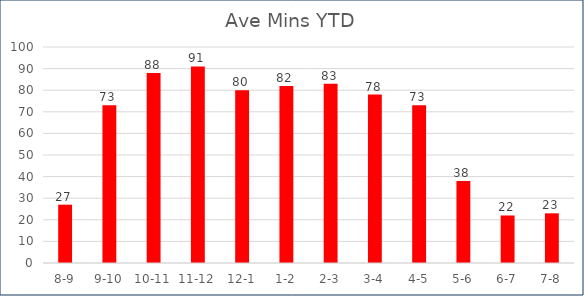
| Category | Ave Mins YTD |
|---|---|
| 8-9 | 27 |
| 9-10 | 73 |
| 10-11 | 88 |
| 11-12 | 91 |
| 12-1 | 80 |
| 1-2 | 82 |
| 2-3 | 83 |
| 3-4 | 78 |
| 4-5 | 73 |
| 5-6 | 38 |
| 6-7 | 22 |
| 7-8 | 23 |